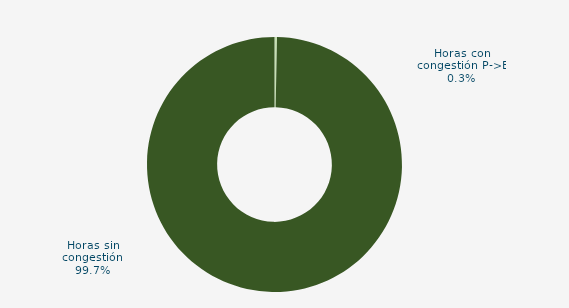
| Category | Horas con congestión E->P |
|---|---|
| Horas con congestión E->P | 0 |
| Horas con congestión P->E | 0.298 |
| Horas sin congestión | 94.345 |